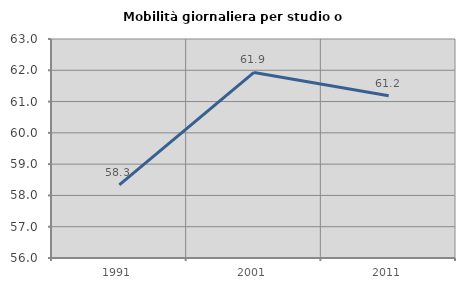
| Category | Mobilità giornaliera per studio o lavoro |
|---|---|
| 1991.0 | 58.337 |
| 2001.0 | 61.932 |
| 2011.0 | 61.188 |